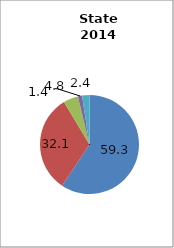
| Category | Arkansas |
|---|---|
| White | 59.329 |
| Black | 32.061 |
| Hispanic | 4.836 |
| Two or More Races | 1.358 |
| All Other1 | 2.416 |